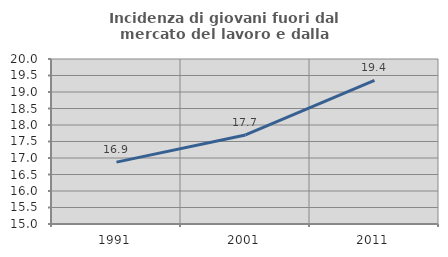
| Category | Incidenza di giovani fuori dal mercato del lavoro e dalla formazione  |
|---|---|
| 1991.0 | 16.875 |
| 2001.0 | 17.699 |
| 2011.0 | 19.355 |